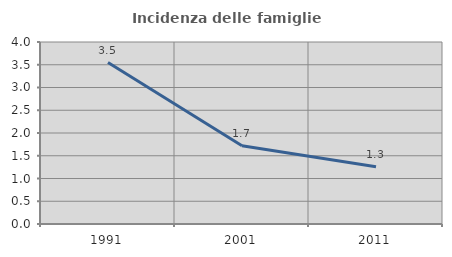
| Category | Incidenza delle famiglie numerose |
|---|---|
| 1991.0 | 3.548 |
| 2001.0 | 1.72 |
| 2011.0 | 1.258 |